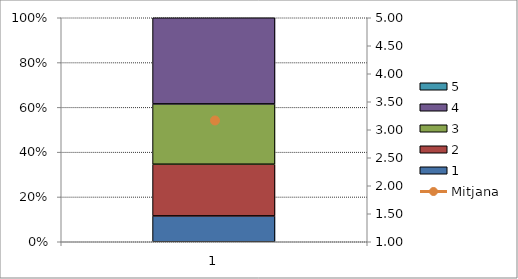
| Category | 1 | 2 | 3 | 4 | 5 |
|---|---|---|---|---|---|
| 0 | 3 | 6 | 7 | 10 | 0 |